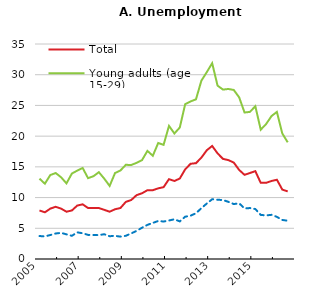
| Category | Total | Young adults (age 15-29) | Long-term |
|---|---|---|---|
| 2005-03-31 | 7.9 | 13.078 | 3.736 |
| 2005-06-30 | 7.6 | 12.259 | 3.686 |
| 2005-09-30 | 8.2 | 13.664 | 3.9 |
| 2005-12-31 | 8.5 | 13.998 | 4.153 |
| 2006-03-31 | 8.2 | 13.305 | 4.254 |
| 2006-06-30 | 7.7 | 12.31 | 4.013 |
| 2006-09-30 | 7.9 | 13.91 | 3.774 |
| 2006-12-31 | 8.7 | 14.388 | 4.339 |
| 2007-03-31 | 8.9 | 14.816 | 4.192 |
| 2007-06-30 | 8.3 | 13.16 | 3.927 |
| 2007-09-30 | 8.3 | 13.48 | 3.904 |
| 2007-12-31 | 8.3 | 14.134 | 3.898 |
| 2008-03-31 | 8 | 13.079 | 4.028 |
| 2008-06-30 | 7.7 | 11.898 | 3.706 |
| 2008-09-30 | 8.1 | 13.996 | 3.772 |
| 2008-12-31 | 8.3 | 14.408 | 3.64 |
| 2009-03-31 | 9.3 | 15.334 | 3.778 |
| 2009-06-30 | 9.6 | 15.3 | 4.167 |
| 2009-09-30 | 10.4 | 15.655 | 4.58 |
| 2009-12-31 | 10.7 | 16.095 | 5.092 |
| 2010-03-31 | 11.2 | 17.599 | 5.558 |
| 2010-06-30 | 11.2 | 16.805 | 5.87 |
| 2010-09-30 | 11.5 | 18.881 | 6.189 |
| 2010-12-31 | 11.7 | 18.588 | 6.102 |
| 2011-03-31 | 13 | 21.668 | 6.27 |
| 2011-06-30 | 12.7 | 20.434 | 6.465 |
| 2011-09-30 | 13.1 | 21.402 | 6.121 |
| 2011-12-31 | 14.6 | 25.21 | 6.887 |
| 2012-03-31 | 15.5 | 25.653 | 7.058 |
| 2012-06-30 | 15.6 | 25.994 | 7.442 |
| 2012-09-30 | 16.5 | 29.024 | 8.279 |
| 2012-12-31 | 17.7 | 30.413 | 9.026 |
| 2013-03-31 | 18.4 | 31.877 | 9.729 |
| 2013-06-30 | 17.2 | 28.225 | 9.646 |
| 2013-09-30 | 16.3 | 27.577 | 9.599 |
| 2013-12-31 | 16.1 | 27.678 | 9.309 |
| 2014-03-31 | 15.7 | 27.52 | 8.943 |
| 2014-06-30 | 14.5 | 26.319 | 9.066 |
| 2014-09-30 | 13.7 | 23.849 | 8.233 |
| 2014-12-31 | 14 | 23.948 | 8.294 |
| 2015-03-31 | 14.3 | 24.878 | 8.136 |
| 2015-06-30 | 12.4 | 21.053 | 7.18 |
| 2015-09-30 | 12.4 | 21.969 | 7.094 |
| 2015-12-31 | 12.7 | 23.274 | 7.191 |
| 2016-03-31 | 12.9 | 23.949 | 6.857 |
| 2016-06-30 | 11.3 | 20.434 | 6.357 |
| 2016-09-30 | 11 | 18.995 | 6.228 |